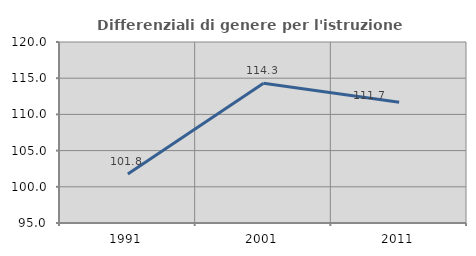
| Category | Differenziali di genere per l'istruzione superiore |
|---|---|
| 1991.0 | 101.755 |
| 2001.0 | 114.301 |
| 2011.0 | 111.674 |